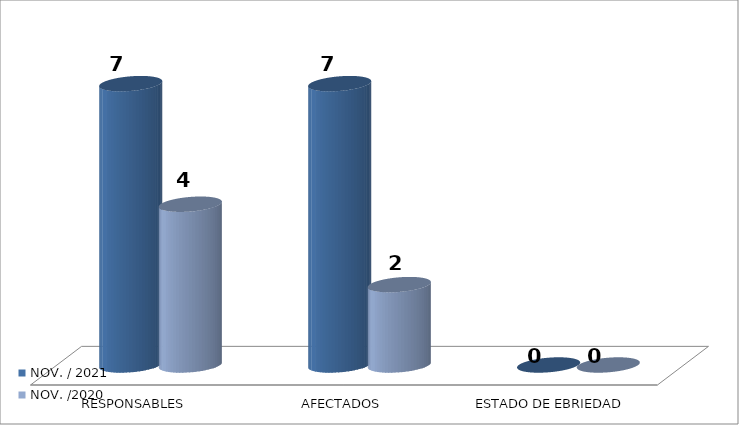
| Category | NOV. / 2021 | NOV. /2020 |
|---|---|---|
| RESPONSABLES | 7 | 4 |
| AFECTADOS | 7 | 2 |
| ESTADO DE EBRIEDAD | 0 | 0 |